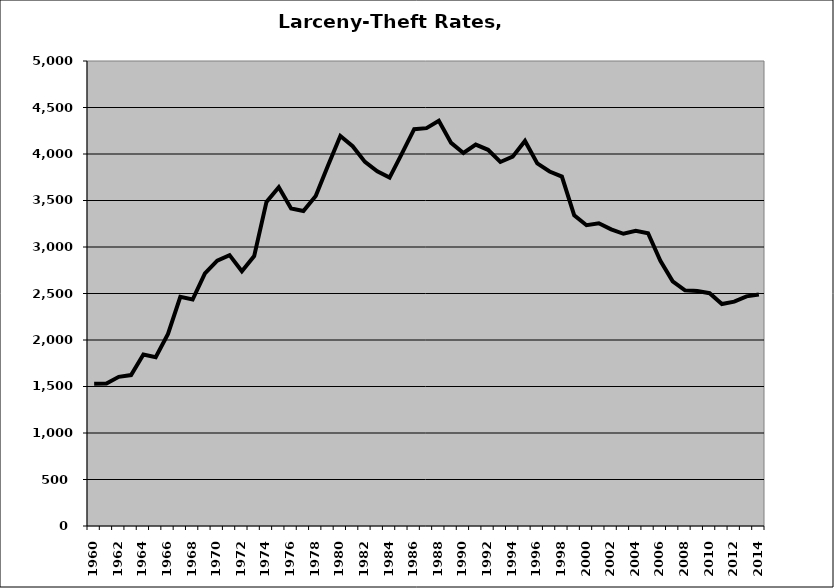
| Category | Larceny-Theft |
|---|---|
| 1960.0 | 1530.099 |
| 1961.0 | 1531.702 |
| 1962.0 | 1603.859 |
| 1963.0 | 1622.623 |
| 1964.0 | 1843.532 |
| 1965.0 | 1815.719 |
| 1966.0 | 2065.872 |
| 1967.0 | 2463.524 |
| 1968.0 | 2435.592 |
| 1969.0 | 2716.373 |
| 1970.0 | 2853.452 |
| 1971.0 | 2912.351 |
| 1972.0 | 2739.936 |
| 1973.0 | 2902.362 |
| 1974.0 | 3484.81 |
| 1975.0 | 3641.648 |
| 1976.0 | 3414.286 |
| 1977.0 | 3386.933 |
| 1978.0 | 3548.781 |
| 1979.0 | 3876.821 |
| 1980.0 | 4192.904 |
| 1981.0 | 4083.428 |
| 1982.0 | 3914.912 |
| 1983.0 | 3812.86 |
| 1984.0 | 3745.804 |
| 1985.0 | 4003.198 |
| 1986.0 | 4266.637 |
| 1987.0 | 4277.898 |
| 1988.0 | 4358.108 |
| 1989.0 | 4119.345 |
| 1990.0 | 4011.37 |
| 1991.0 | 4101.515 |
| 1992.0 | 4045.074 |
| 1993.0 | 3914.386 |
| 1994.0 | 3971.514 |
| 1995.0 | 4140.324 |
| 1996.0 | 3898.536 |
| 1997.0 | 3811.462 |
| 1998.0 | 3757.655 |
| 1999.0 | 3341.243 |
| 2000.0 | 3234.579 |
| 2001.0 | 3255.803 |
| 2002.0 | 3189.782 |
| 2003.0 | 3142.124 |
| 2004.0 | 3173.361 |
| 2005.0 | 3147.396 |
| 2006.0 | 2850.887 |
| 2007.0 | 2630.254 |
| 2008.0 | 2533.996 |
| 2009.0 | 2527.252 |
| 2010.0 | 2503.666 |
| 2011.0 | 2386.364 |
| 2012.0 | 2412.333 |
| 2013.0 | 2469.65 |
| 2014.0 | 2489.106 |